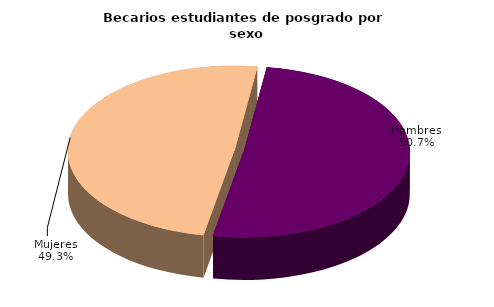
| Category | Series 0 |
|---|---|
| Hombres | 16221 |
| Mujeres | 15758 |